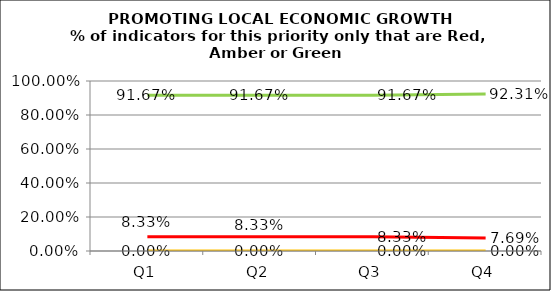
| Category | Green | Amber | Red |
|---|---|---|---|
| Q1 | 0.917 | 0 | 0.083 |
| Q2 | 0.917 | 0 | 0.083 |
| Q3 | 0.917 | 0 | 0.083 |
| Q4 | 0.923 | 0 | 0.077 |